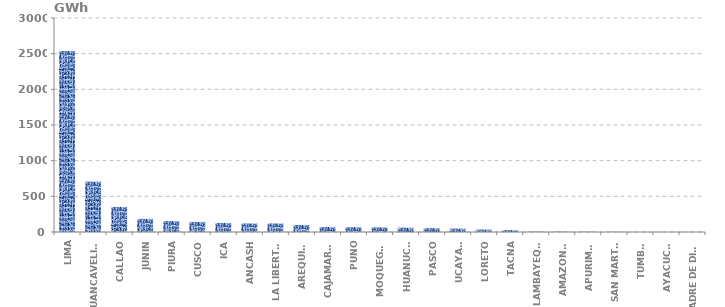
| Category | Series 0 |
|---|---|
| LIMA | 2536.702 |
| HUANCAVELICA | 706.216 |
| CALLAO | 350.525 |
| JUNIN | 183.272 |
| PIURA | 152.765 |
| CUSCO | 141.462 |
| ICA | 126.472 |
| ANCASH | 119.565 |
| LA LIBERTAD | 119.5 |
| AREQUIPA | 98.675 |
| CAJAMARCA | 68.946 |
| PUNO | 67.52 |
| MOQUEGUA | 65.024 |
| HUANUCO | 61.098 |
| PASCO | 54.068 |
| UCAYALI | 48.513 |
| LORETO | 34.28 |
| TACNA | 26.526 |
| LAMBAYEQUE | 5.175 |
| AMAZONAS | 4.494 |
| APURIMAC | 3.26 |
| SAN MARTÍN | 2.457 |
| TUMBES | 1.101 |
| AYACUCHO | 0.858 |
| MADRE DE DIOS | 0.282 |